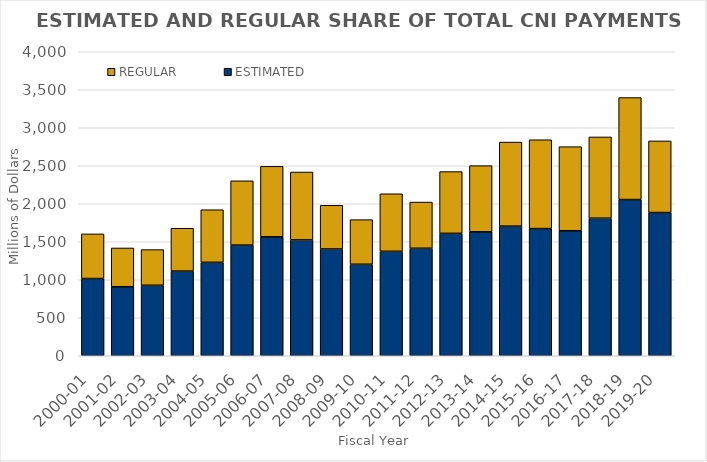
| Category | ESTIMATED | REGULAR |
|---|---|---|
| 2000-01 | 1016.4 | 587 |
| 2001-02 | 907.7 | 510.8 |
| 2002-03 | 927.5 | 469.1 |
| 2003-04 | 1114.4 | 563.6 |
| 2004-05 | 1229.3 | 692.1 |
| 2005-06 | 1456.4 | 845.6 |
| 2006-07 | 1564.8 | 927.7 |
| 2007-08 | 1524.1 | 893.6 |
| 2008-09 | 1405.2 | 574.7 |
| 2009-10 | 1204.279 | 586.684 |
| 2010-11 | 1374.453 | 756.998 |
| 2011-12 | 1414.7 | 607.7 |
| 2012-13 | 1610.668 | 812.773 |
| 2013-14 | 1630.842 | 870.793 |
| 2014-15 | 1705.6 | 1105.9 |
| 2015-16 | 1673.5 | 1168.8 |
| 2016-17 | 1644.9 | 1106.5 |
| 2017-18 | 1810.292 | 1068.732 |
| 2018-19 | 2055.199 | 1342.344 |
| 2019-20 | 1884.699 | 942.181 |